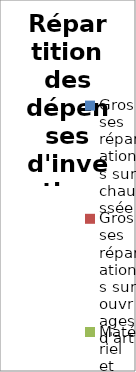
| Category | Series 0 |
|---|---|
| Grosses réparations sur chaussée | 0 |
| Grosses réparations sur ouvrages d'art | 0 |
| Matériel et outillage de voirie | 0 |
| Autres opérations d'investissement sur voirie | 0 |